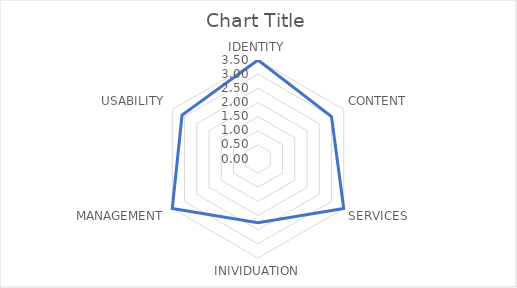
| Category | Series 0 |
|---|---|
| IDENTITY | 3.5 |
| CONTENT | 3 |
| SERVICES | 3.5 |
| INIVIDUATION | 2.25 |
| MANAGEMENT | 3.5 |
| USABILITY | 3.1 |